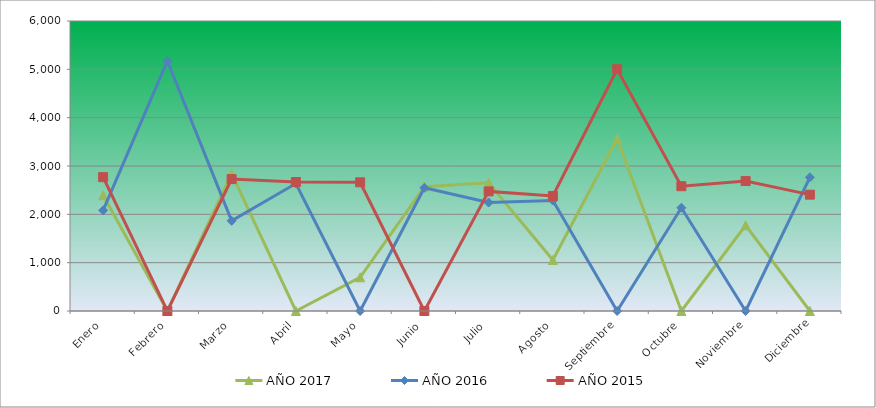
| Category | AÑO 2017 | AÑO 2016 | AÑO 2015 |
|---|---|---|---|
| Enero | 2395.951 | 2082.494 | 2769.486 |
| Febrero | 0 | 5172.429 | 0 |
| Marzo | 2842.654 | 1866.131 | 2729.252 |
| Abril | 0 | 2636.924 | 2668.9 |
| Mayo | 697.127 | 0 | 2662.194 |
| Junio | 2571.925 | 2549.027 | 0 |
| Julio | 2653.144 | 2244.766 | 2474.432 |
| Agosto | 1055.843 | 2285.335 | 2380.551 |
| Septiembre | 3560.086 | 0 | 5002.511 |
| Octubre | 0 | 2136.585 | 2581.725 |
| Noviembre | 1773.275 | 0 | 2689.017 |
| Diciembre | 0 | 2765.39 | 2407.374 |